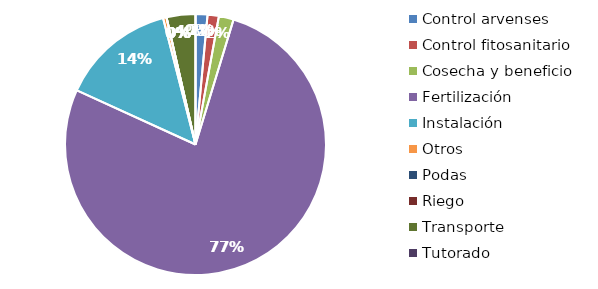
| Category | Valor |
|---|---|
| Control arvenses | 872616 |
| Control fitosanitario | 826104.7 |
| Cosecha y beneficio | 1083744 |
| Fertilización | 45589672 |
| Instalación | 8387550 |
| Otros | 252888 |
| Podas | 0 |
| Riego | 0 |
| Transporte | 2111609 |
| Tutorado | 0 |